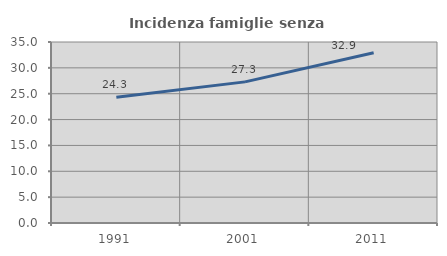
| Category | Incidenza famiglie senza nuclei |
|---|---|
| 1991.0 | 24.336 |
| 2001.0 | 27.291 |
| 2011.0 | 32.904 |